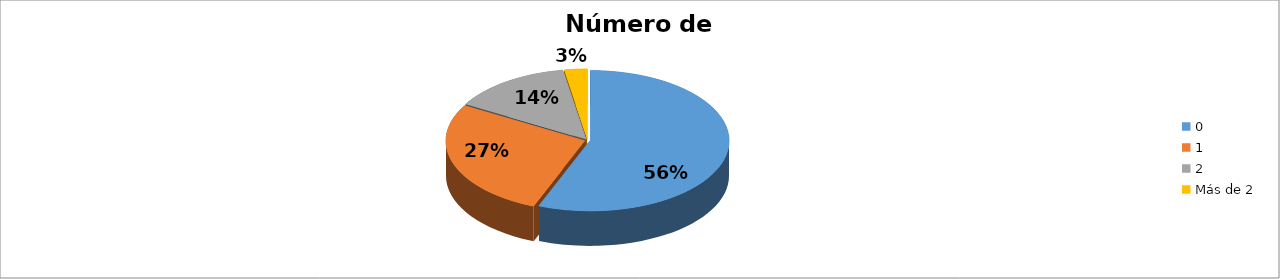
| Category | Series 0 |
|---|---|
| 0 | 0.56 |
| 1 | 0.273 |
| 2 | 0.14 |
| Más de 2 | 0.027 |